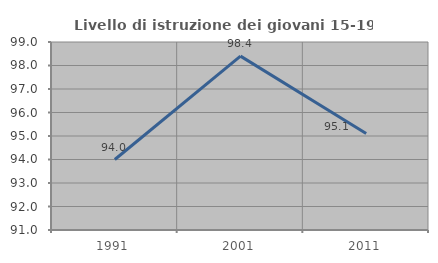
| Category | Livello di istruzione dei giovani 15-19 anni |
|---|---|
| 1991.0 | 94 |
| 2001.0 | 98.4 |
| 2011.0 | 95.105 |